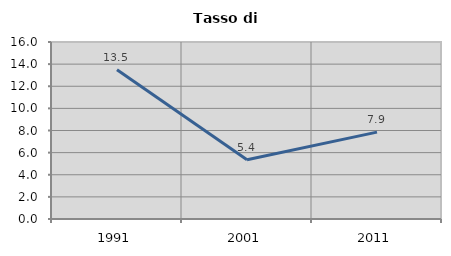
| Category | Tasso di disoccupazione   |
|---|---|
| 1991.0 | 13.483 |
| 2001.0 | 5.359 |
| 2011.0 | 7.855 |